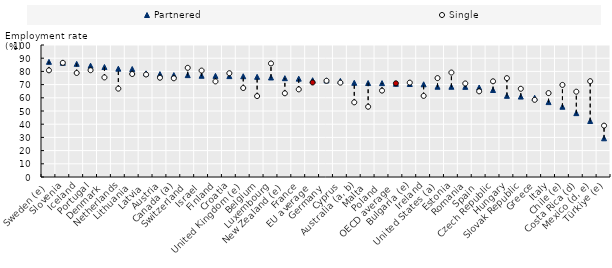
| Category | Partnered | Single |
|---|---|---|
| Sweden (e) | 87.247 | 80.805 |
| Slovenia | 86.576 | 86.507 |
| Iceland | 85.722 | 78.812 |
| Portugal | 84.317 | 80.894 |
| Denmark | 83.339 | 75.447 |
| Netherlands | 82.07 | 66.942 |
| Lithuania | 81.829 | 78.02 |
| Latvia | 78.535 | 77.64 |
| Austria | 77.952 | 75.198 |
| Canada (a) | 77.215 | 74.779 |
| Switzerland | 77.173 | 82.705 |
| Israel | 76.701 | 80.62 |
| Finland | 76.631 | 72.42 |
| Croatia | 76.442 | 78.635 |
| United Kingdom (e) | 76.341 | 67.403 |
| Belgium | 75.906 | 61.302 |
| Luxembourg | 75.397 | 86.028 |
| New Zealand (e) | 74.865 | 63.419 |
| France | 74.514 | 66.378 |
| EU average | 73.309 | 71.603 |
| Germany | 73.204 | 72.881 |
| Cyprus | 72.802 | 71.459 |
| Australia (a, b) | 71.374 | 56.571 |
| Malta | 71.193 | 53.214 |
| Poland | 71.111 | 65.439 |
| OECD average | 70.626 | 70.964 |
| Bulgaria (e) | 70.477 | 71.479 |
| Ireland | 70.229 | 61.432 |
| United States (a) | 68.397 | 74.918 |
| Estonia | 68.362 | 79.143 |
| Romania | 68.297 | 70.857 |
| Spain | 67.821 | 64.898 |
| Czech Republic | 65.919 | 72.499 |
| Hungary | 61.498 | 74.888 |
| Slovak Republic | 60.934 | 66.837 |
| Greece | 60.004 | 58.468 |
| Italy | 56.741 | 63.561 |
| Chile (e) | 53.242 | 69.767 |
| Costa Rica (d) | 48.388 | 64.629 |
| Mexico (d, e) | 42.404 | 72.595 |
| Türkiye (e) | 29.324 | 38.915 |